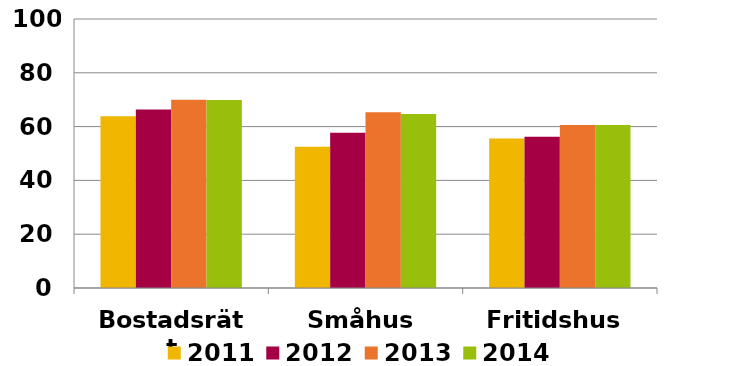
| Category | 2011 | 2012 | 2013 | 2014 |
|---|---|---|---|---|
| Bostadsrätt | 63.871 | 66.38 | 69.994 | 69.904 |
| Småhus | 52.512 | 57.707 | 65.289 | 64.729 |
| Fritidshus | 55.616 | 56.185 | 60.573 | 60.579 |